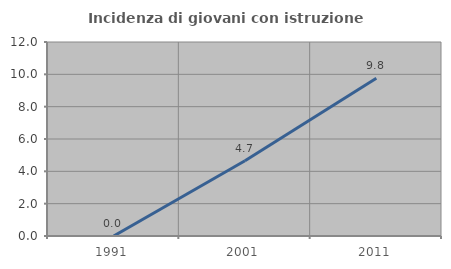
| Category | Incidenza di giovani con istruzione universitaria |
|---|---|
| 1991.0 | 0 |
| 2001.0 | 4.651 |
| 2011.0 | 9.756 |